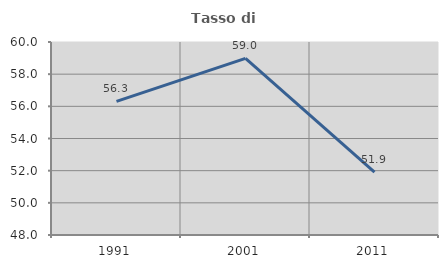
| Category | Tasso di occupazione   |
|---|---|
| 1991.0 | 56.312 |
| 2001.0 | 58.978 |
| 2011.0 | 51.908 |